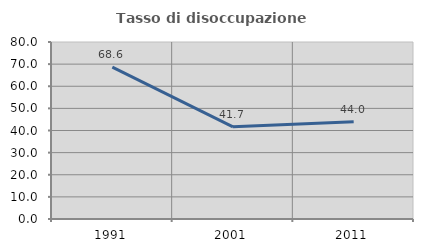
| Category | Tasso di disoccupazione giovanile  |
|---|---|
| 1991.0 | 68.639 |
| 2001.0 | 41.667 |
| 2011.0 | 44 |